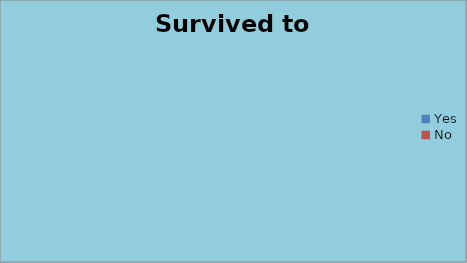
| Category | Survived to Discharge |
|---|---|
| Yes | 0 |
| No | 0 |